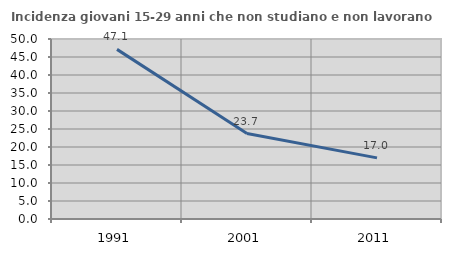
| Category | Incidenza giovani 15-29 anni che non studiano e non lavorano  |
|---|---|
| 1991.0 | 47.12 |
| 2001.0 | 23.729 |
| 2011.0 | 16.981 |